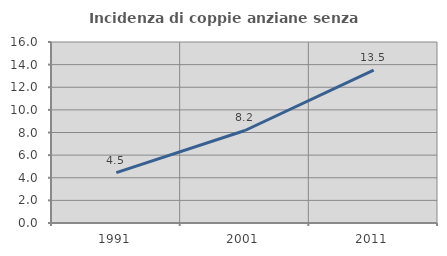
| Category | Incidenza di coppie anziane senza figli  |
|---|---|
| 1991.0 | 4.453 |
| 2001.0 | 8.178 |
| 2011.0 | 13.516 |